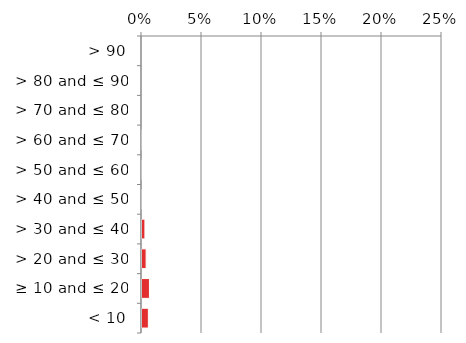
| Category | Near native & fragments |
|---|---|
|  < 10 | 0.006 |
|  ≥ 10 and ≤ 20 | 0.007 |
|  > 20 and ≤ 30 | 0.004 |
|  > 30 and ≤ 40 | 0.003 |
|  > 40 and ≤ 50 | 0.001 |
|  > 50 and ≤ 60 | 0.001 |
|  > 60 and ≤ 70 | 0 |
|  > 70 and ≤ 80 | 0 |
|  > 80 and ≤ 90 | 0 |
|  > 90 | 0 |